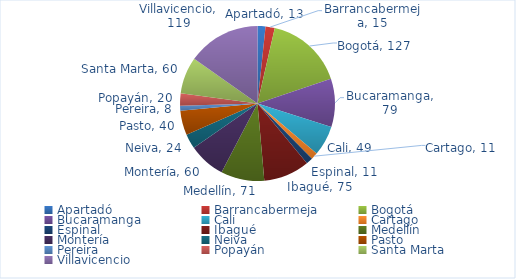
| Category | Series 0 |
|---|---|
| Apartadó | 13 |
| Barrancabermeja | 15 |
| Bogotá | 127 |
| Bucaramanga | 79 |
| Cali | 49 |
| Cartago | 11 |
| Espinal | 11 |
| Ibagué | 75 |
| Medellín | 71 |
| Montería | 60 |
| Neiva | 24 |
| Pasto | 40 |
| Pereira | 8 |
| Popayán | 20 |
| Santa Marta | 60 |
| Villavicencio | 119 |